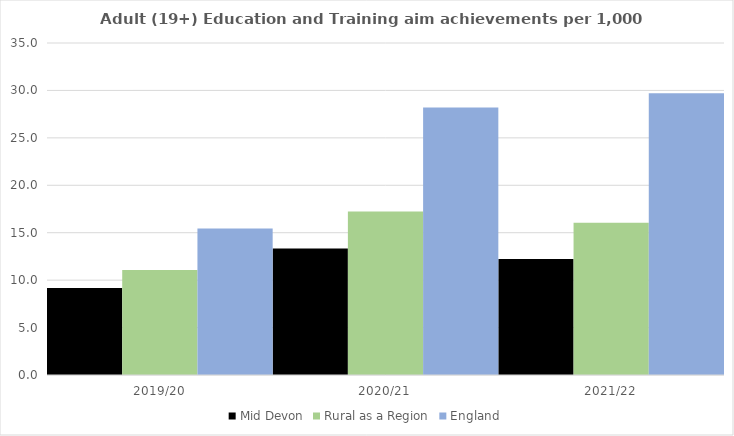
| Category | Mid Devon | Rural as a Region | England |
|---|---|---|---|
| 2019/20 | 9.164 | 11.081 | 15.446 |
| 2020/21 | 13.344 | 17.224 | 28.211 |
| 2021/22 | 12.226 | 16.063 | 29.711 |